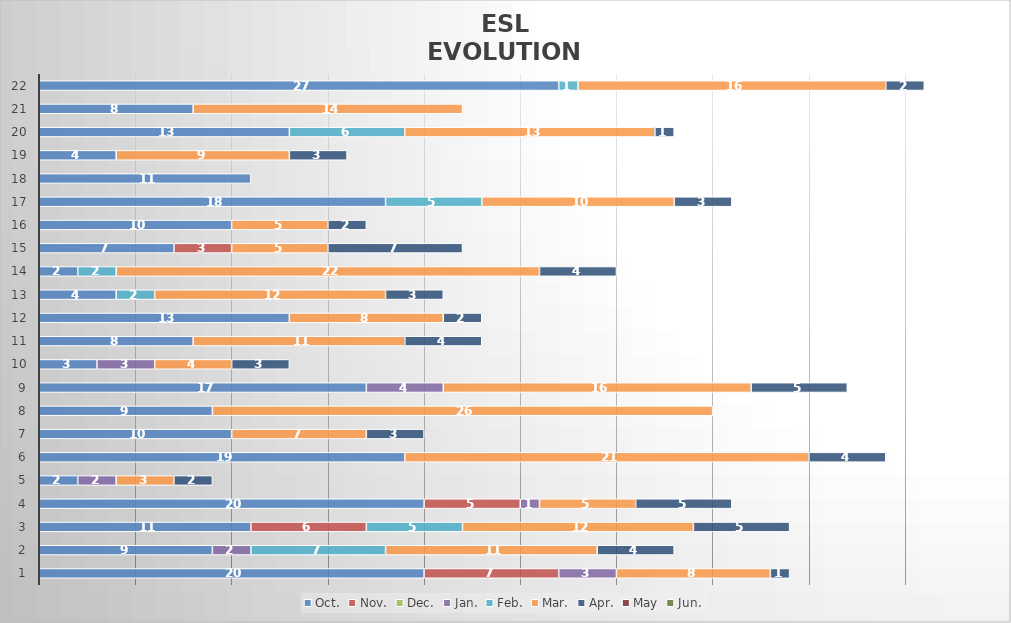
| Category | Oct. | Nov. | Dec. | Jan. | Feb. | Mar. | Apr. | May | Jun. |
|---|---|---|---|---|---|---|---|---|---|
| 1.0 | 20 | 7 | 0 | 3 | 0 | 8 | 1 | 0 | 0 |
| 2.0 | 9 | 0 | 0 | 2 | 7 | 11 | 4 | 0 | 0 |
| 3.0 | 11 | 6 | 0 | 0 | 5 | 12 | 5 | 0 | 0 |
| 4.0 | 20 | 5 | 0 | 1 | 0 | 5 | 5 | 0 | 0 |
| 5.0 | 2 | 0 | 0 | 2 | 0 | 3 | 2 | 0 | 0 |
| 6.0 | 19 | 0 | 0 | 0 | 0 | 21 | 4 | 0 | 0 |
| 7.0 | 10 | 0 | 0 | 0 | 0 | 7 | 3 | 0 | 0 |
| 8.0 | 9 | 0 | 0 | 0 | 0 | 26 | 0 | 0 | 0 |
| 9.0 | 17 | 0 | 0 | 4 | 0 | 16 | 5 | 0 | 0 |
| 10.0 | 3 | 0 | 0 | 3 | 0 | 4 | 3 | 0 | 0 |
| 11.0 | 8 | 0 | 0 | 0 | 0 | 11 | 4 | 0 | 0 |
| 12.0 | 13 | 0 | 0 | 0 | 0 | 8 | 2 | 0 | 0 |
| 13.0 | 4 | 0 | 0 | 0 | 2 | 12 | 3 | 0 | 0 |
| 14.0 | 2 | 0 | 0 | 0 | 2 | 22 | 4 | 0 | 0 |
| 15.0 | 7 | 3 | 0 | 0 | 0 | 5 | 7 | 0 | 0 |
| 16.0 | 10 | 0 | 0 | 0 | 0 | 5 | 2 | 0 | 0 |
| 17.0 | 18 | 0 | 0 | 0 | 5 | 10 | 3 | 0 | 0 |
| 18.0 | 11 | 0 | 0 | 0 | 0 | 0 | 0 | 0 | 0 |
| 19.0 | 4 | 0 | 0 | 0 | 0 | 9 | 3 | 0 | 0 |
| 20.0 | 13 | 0 | 0 | 0 | 6 | 13 | 1 | 0 | 0 |
| 21.0 | 8 | 0 | 0 | 0 | 0 | 14 | 0 | 0 | 0 |
| 22.0 | 27 | 0 | 0 | 0 | 1 | 16 | 2 | 0 | 0 |